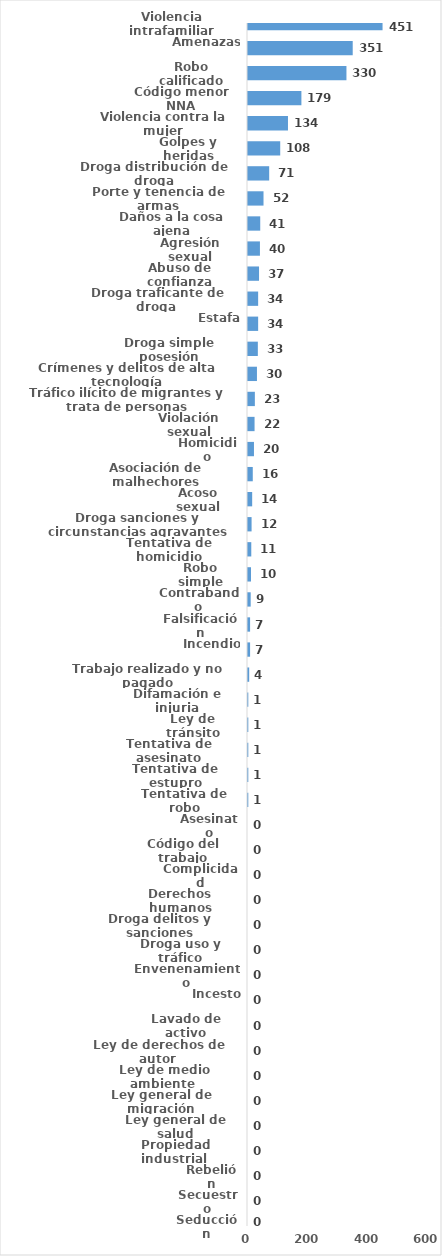
| Category | Series 0 |
|---|---|
| Violencia intrafamiliar | 451 |
| Amenazas | 351 |
| Robo calificado | 330 |
| Código menor NNA | 179 |
| Violencia contra la mujer | 134 |
| Golpes y heridas | 108 |
| Droga distribución de droga | 71 |
| Porte y tenencia de armas | 52 |
| Daños a la cosa ajena | 41 |
| Agresión sexual | 40 |
| Abuso de confianza | 37 |
| Droga traficante de droga  | 34 |
| Estafa | 34 |
| Droga simple posesión | 33 |
| Crímenes y delitos de alta tecnología | 30 |
| Tráfico ilícito de migrantes y trata de personas | 23 |
| Violación sexual | 22 |
| Homicidio | 20 |
| Asociación de malhechores | 16 |
| Acoso sexual | 14 |
| Droga sanciones y circunstancias agravantes | 12 |
| Tentativa de homicidio | 11 |
| Robo simple | 10 |
| Contrabando | 9 |
| Falsificación | 7 |
| Incendio | 7 |
| Trabajo realizado y no pagado | 4 |
| Difamación e injuria | 1 |
| Ley de tránsito | 1 |
| Tentativa de asesinato | 1 |
| Tentativa de estupro | 1 |
| Tentativa de robo | 1 |
| Asesinato | 0 |
| Código del trabajo | 0 |
| Complicidad | 0 |
| Derechos humanos | 0 |
| Droga delitos y sanciones | 0 |
| Droga uso y tráfico | 0 |
| Envenenamiento | 0 |
| Incesto | 0 |
| Lavado de activo | 0 |
| Ley de derechos de autor  | 0 |
| Ley de medio ambiente  | 0 |
| Ley general de migración | 0 |
| Ley general de salud | 0 |
| Propiedad industrial  | 0 |
| Rebelión | 0 |
| Secuestro | 0 |
| Seducción | 0 |